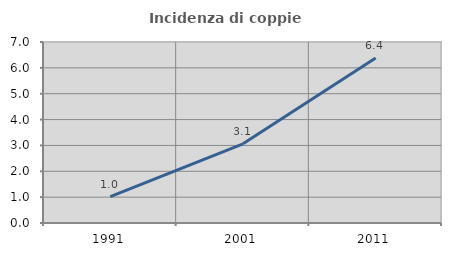
| Category | Incidenza di coppie miste |
|---|---|
| 1991.0 | 1.02 |
| 2001.0 | 3.061 |
| 2011.0 | 6.383 |